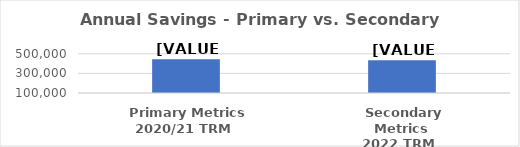
| Category | Series 0 |
|---|---|
| Primary Metrics
2020/21 TRM | 444414 |
| Secondary Metrics
2022 TRM | 434534.137 |